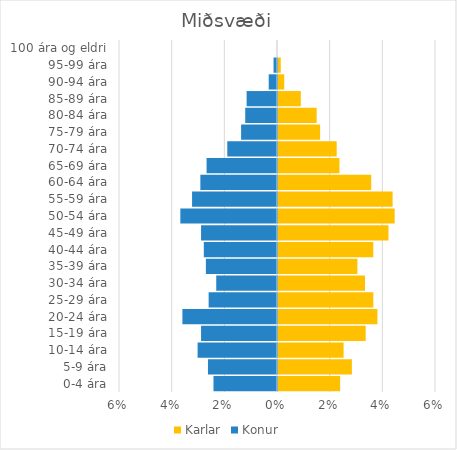
| Category | Karlar | Konur |
|---|---|---|
| 0-4 ára | 0.024 | -0.024 |
| 5-9 ára | 0.028 | -0.026 |
| 10-14 ára | 0.025 | -0.03 |
| 15-19 ára | 0.033 | -0.029 |
| 20-24 ára | 0.038 | -0.036 |
| 25-29 ára | 0.036 | -0.026 |
| 30-34 ára | 0.033 | -0.023 |
| 35-39 ára | 0.03 | -0.027 |
| 40-44 ára | 0.036 | -0.028 |
| 45-49 ára | 0.042 | -0.029 |
| 50-54 ára | 0.044 | -0.037 |
| 55-59 ára | 0.044 | -0.032 |
| 60-64 ára | 0.035 | -0.029 |
| 65-69 ára | 0.023 | -0.027 |
| 70-74 ára | 0.022 | -0.019 |
| 75-79 ára | 0.016 | -0.014 |
| 80-84 ára | 0.015 | -0.012 |
| 85-89 ára | 0.009 | -0.012 |
| 90-94 ára | 0.002 | -0.003 |
| 95-99 ára | 0.001 | -0.001 |
| 100 ára og eldri | 0 | 0 |